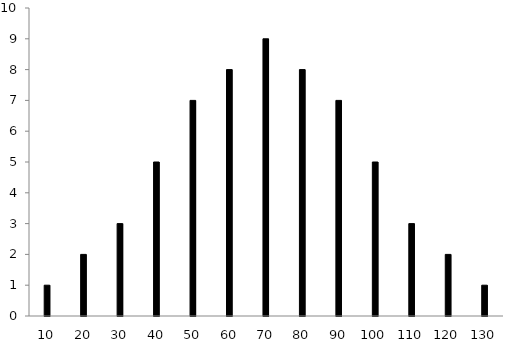
| Category | Series 0 |
|---|---|
| 10.0 | 1 |
| 20.0 | 2 |
| 30.0 | 3 |
| 40.0 | 5 |
| 50.0 | 7 |
| 60.0 | 8 |
| 70.0 | 9 |
| 80.0 | 8 |
| 90.0 | 7 |
| 100.0 | 5 |
| 110.0 | 3 |
| 120.0 | 2 |
| 130.0 | 1 |